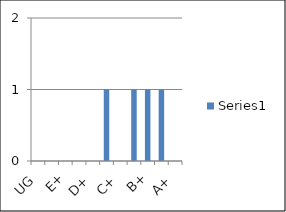
| Category | Series 0 |
|---|---|
| UG | 0 |
| E | 0 |
| E+ | 0 |
| D | 0 |
| D+ | 0 |
| C | 1 |
| C+ | 0 |
| B | 1 |
| B+ | 1 |
| A | 1 |
| A+ | 0 |